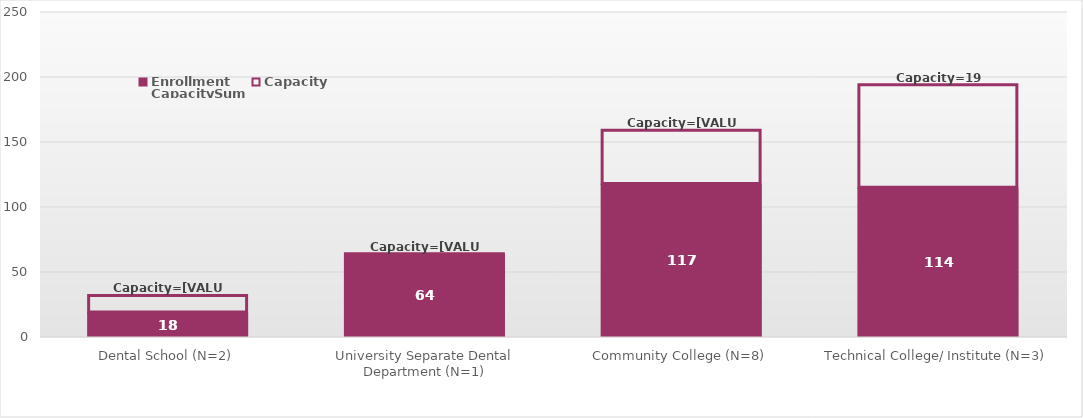
| Category | Enrollment | Capacity  | CapacitySum |
|---|---|---|---|
| Dental School (N=2) | 18 | 14 | 32 |
| University Separate Dental Department (N=1) | 64 | 0 | 64 |
| Community College (N=8) | 117 | 42 | 159 |
| Technical College/ Institute (N=3) | 114 | 80 | 194 |